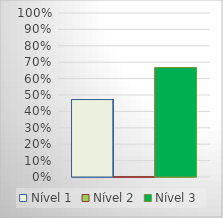
| Category | Nível 1 | Nível 2 | Nível 3 |
|---|---|---|---|
| 0 | 0.472 | 0 | 0.667 |